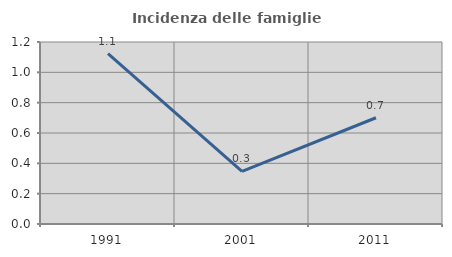
| Category | Incidenza delle famiglie numerose |
|---|---|
| 1991.0 | 1.123 |
| 2001.0 | 0.347 |
| 2011.0 | 0.701 |